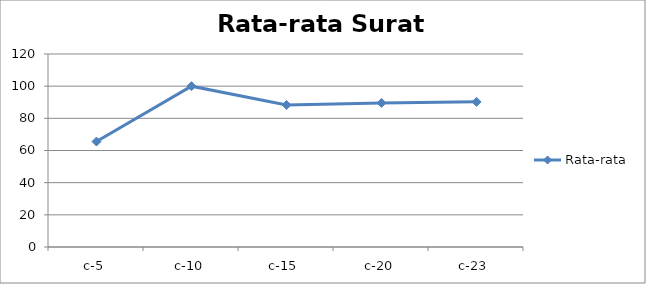
| Category | Rata-rata |
|---|---|
| c-5 | 65.584 |
| c-10 | 100 |
| c-15 | 88.312 |
| c-20 | 89.61 |
| c-23 | 90.26 |